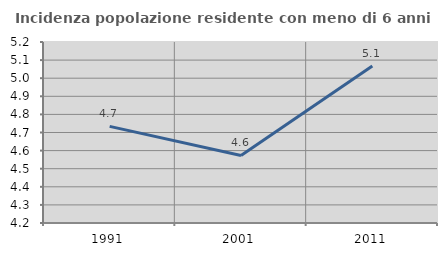
| Category | Incidenza popolazione residente con meno di 6 anni |
|---|---|
| 1991.0 | 4.734 |
| 2001.0 | 4.573 |
| 2011.0 | 5.068 |